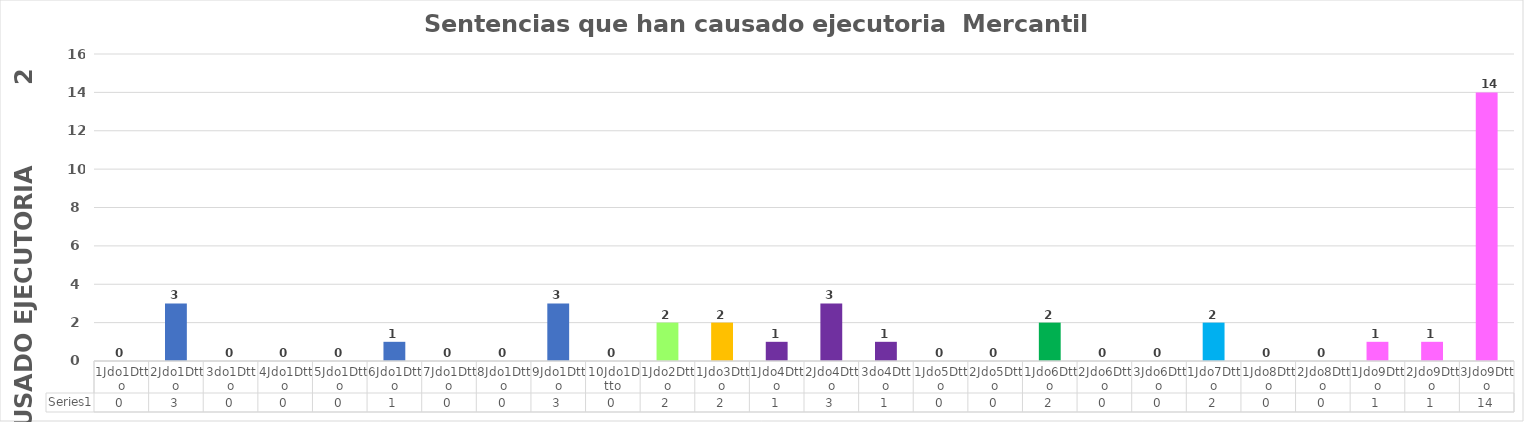
| Category | Series 0 |
|---|---|
| 1Jdo1Dtto | 0 |
| 2Jdo1Dtto | 3 |
| 3do1Dtto | 0 |
| 4Jdo1Dtto | 0 |
| 5Jdo1Dtto | 0 |
| 6Jdo1Dtto | 1 |
| 7Jdo1Dtto | 0 |
| 8Jdo1Dtto | 0 |
| 9Jdo1Dtto | 3 |
| 10Jdo1Dtto | 0 |
| 1Jdo2Dtto | 2 |
| 1Jdo3Dtto | 2 |
| 1Jdo4Dtto | 1 |
| 2Jdo4Dtto | 3 |
| 3do4Dtto | 1 |
| 1Jdo5Dtto | 0 |
| 2Jdo5Dtto | 0 |
| 1Jdo6Dtto | 2 |
| 2Jdo6Dtto | 0 |
| 3Jdo6Dtto | 0 |
| 1Jdo7Dtto | 2 |
| 1Jdo8Dtto | 0 |
| 2Jdo8Dtto | 0 |
| 1Jdo9Dtto | 1 |
| 2Jdo9Dtto | 1 |
| 3Jdo9Dtto | 14 |